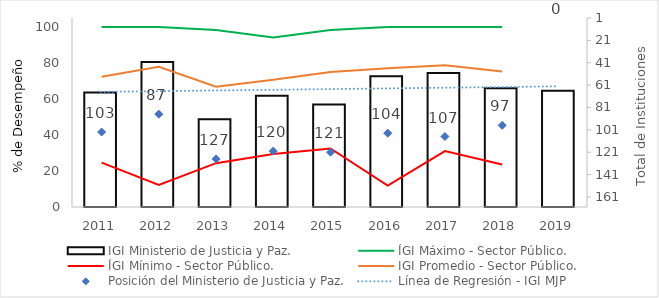
| Category | IGI Ministerio de Justicia y Paz. |
|---|---|
| 2011.0 | 63.65 |
| 2012.0 | 80.52 |
| 2013.0 | 48.7 |
| 2014.0 | 61.8 |
| 2015.0 | 57 |
| 2016.0 | 72.7 |
| 2017.0 | 74.5 |
| 2018.0 | 66 |
| 2019.0 | 64.65 |